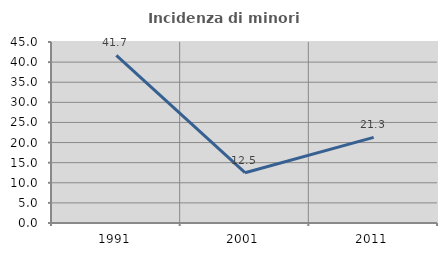
| Category | Incidenza di minori stranieri |
|---|---|
| 1991.0 | 41.667 |
| 2001.0 | 12.5 |
| 2011.0 | 21.277 |